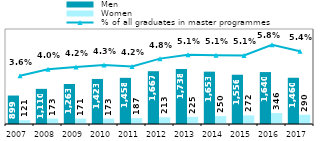
| Category |  Men |  Women |
|---|---|---|
| 2007.0 | 899 | 121 |
| 2008.0 | 1110 | 173 |
| 2009.0 | 1263 | 171 |
| 2010.0 | 1423 | 173 |
| 2011.0 | 1458 | 187 |
| 2012.0 | 1667 | 213 |
| 2013.0 | 1738 | 225 |
| 2014.0 | 1653 | 250 |
| 2015.0 | 1556 | 272 |
| 2016.0 | 1640 | 346 |
| 2017.0 | 1460 | 290 |